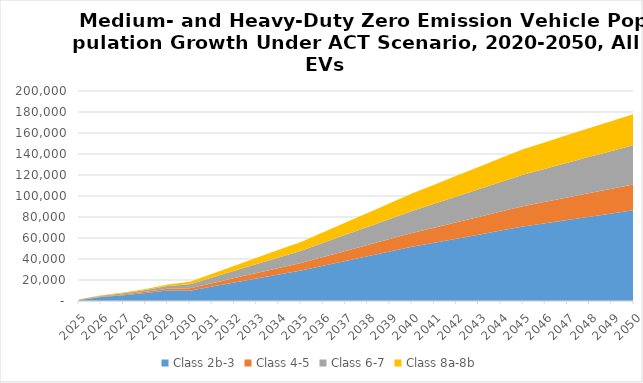
| Category | Class 2b-3 | Class 4-5 | Class 6-7 | Class 8a-8b |
|---|---|---|---|---|
| 2025.0 | 914.401 | 204.676 | 302.151 | 203.847 |
| 2026.0 | 3853.592 | 441.402 | 664.039 | 434.74 |
| 2027.0 | 5570.111 | 728.592 | 1116.382 | 707.899 |
| 2028.0 | 7596.965 | 1119.256 | 1745.84 | 1048.921 |
| 2029.0 | 9984.133 | 1637.744 | 2599.294 | 1476.741 |
| 2030.0 | 9857.847 | 2343.121 | 3782.126 | 2370.819 |
| 2031.0 | 13694.286 | 3323.821 | 5351.877 | 3570.766 |
| 2032.0 | 17530.725 | 4304.521 | 6921.628 | 4770.713 |
| 2033.0 | 21367.163 | 5285.22 | 8491.378 | 5970.66 |
| 2034.0 | 25203.602 | 6265.92 | 10061.129 | 7170.606 |
| 2035.0 | 29040.041 | 7246.619 | 11630.88 | 8370.553 |
| 2036.0 | 33560.28 | 8421.005 | 13495.022 | 10024.99 |
| 2037.0 | 38080.519 | 9595.392 | 15359.164 | 11679.427 |
| 2038.0 | 42600.758 | 10769.778 | 17223.306 | 13333.864 |
| 2039.0 | 47120.997 | 11944.164 | 19087.448 | 14988.301 |
| 2040.0 | 51641.236 | 13118.55 | 20951.59 | 16642.738 |
| 2041.0 | 55498.467 | 14368.048 | 22773.744 | 18148.226 |
| 2042.0 | 59355.697 | 15617.547 | 24595.899 | 19653.714 |
| 2043.0 | 63212.928 | 16867.045 | 26418.053 | 21159.202 |
| 2044.0 | 67070.158 | 18116.544 | 28240.208 | 22664.69 |
| 2045.0 | 70927.389 | 19366.042 | 30062.362 | 24170.179 |
| 2046.0 | 74032.992 | 20429.25 | 31535.852 | 25273.874 |
| 2047.0 | 77138.596 | 21492.458 | 33009.342 | 26377.569 |
| 2048.0 | 80244.199 | 22555.666 | 34482.832 | 27481.265 |
| 2049.0 | 83349.803 | 23618.874 | 35956.322 | 28584.96 |
| 2050.0 | 86455.406 | 24682.082 | 37429.812 | 29688.655 |